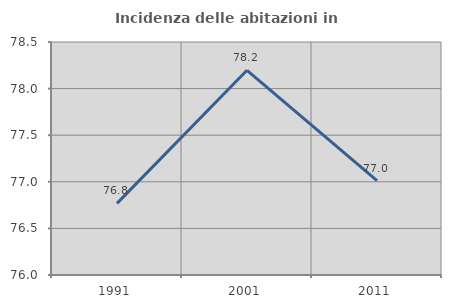
| Category | Incidenza delle abitazioni in proprietà  |
|---|---|
| 1991.0 | 76.769 |
| 2001.0 | 78.196 |
| 2011.0 | 77.012 |